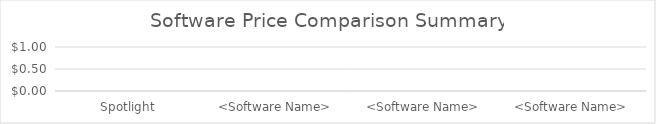
| Category | Series 0 |
|---|---|
| Spotlight | 0 |
| <Software Name> | 0 |
| <Software Name> | 0 |
| <Software Name> | 0 |